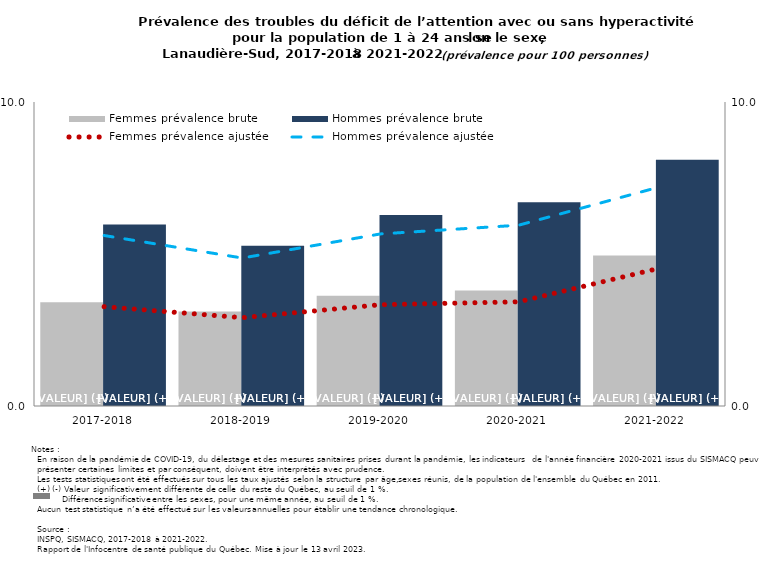
| Category | Femmes prévalence brute | Hommes prévalence brute |
|---|---|---|
| 2017-2018 | 3.413 | 5.967 |
| 2018-2019 | 3.112 | 5.272 |
| 2019-2020 | 3.626 | 6.28 |
| 2020-2021 | 3.797 | 6.703 |
| 2021-2022 | 4.953 | 8.103 |